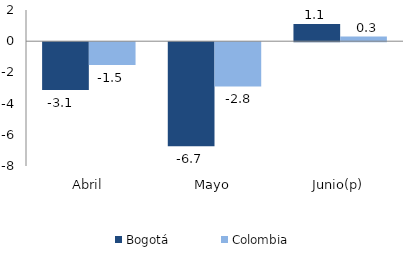
| Category | Bogotá | Colombia |
|---|---|---|
| Abril | -3.066 | -1.463 |
| Mayo | -6.664 | -2.833 |
| Junio(p) | 1.101 | 0.296 |